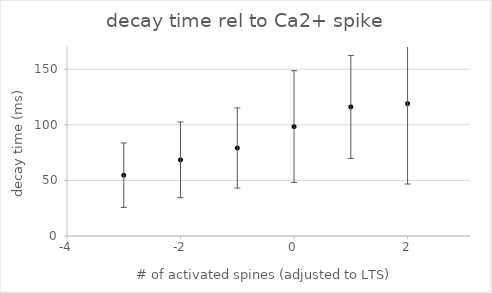
| Category | Series 0 |
|---|---|
| -3.0 | 54.714 |
| -2.0 | 68.526 |
| -1.0 | 79.167 |
| 0.0 | 98.409 |
| 1.0 | 116.111 |
| 2.0 | 119.059 |